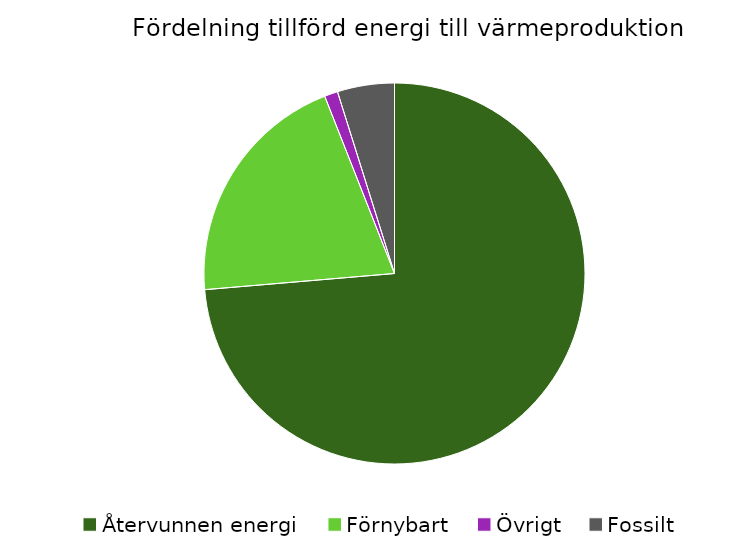
| Category | Fördelning värmeproduktion |
|---|---|
| Återvunnen energi | 0.736 |
| Förnybart | 0.204 |
| Övrigt | 0.011 |
| Fossilt | 0.048 |